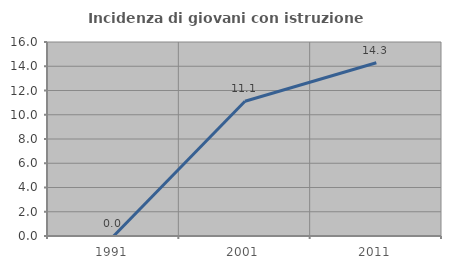
| Category | Incidenza di giovani con istruzione universitaria |
|---|---|
| 1991.0 | 0 |
| 2001.0 | 11.111 |
| 2011.0 | 14.286 |